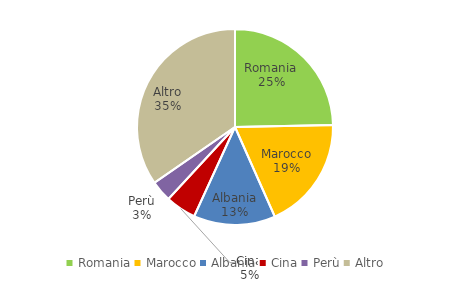
| Category | Series 0 |
|---|---|
| Romania | 4303 |
| Marocco | 3252 |
| Albania | 2350 |
| Cina | 880 |
| Perù | 608 |
| Altro | 6037 |